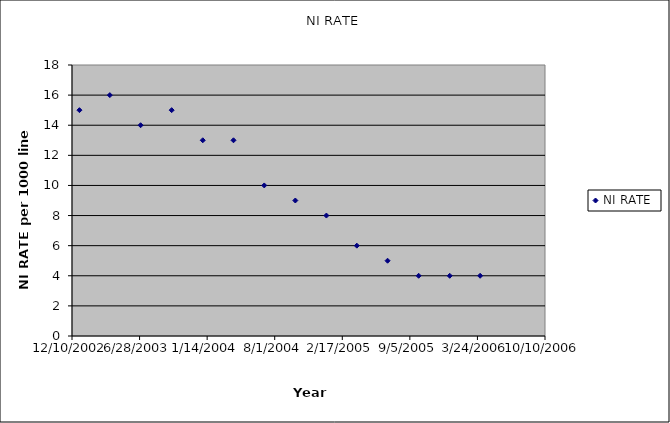
| Category | NI RATE |
|---|---|
| 37622.0 | 15 |
| 37712.0 | 16 |
| 37803.0 | 14 |
| 37895.0 | 15 |
| 37987.0 | 13 |
| 38078.0 | 13 |
| 38169.0 | 10 |
| 38261.0 | 9 |
| 38353.0 | 8 |
| 38443.0 | 6 |
| 38534.0 | 5 |
| 38626.0 | 4 |
| 38718.0 | 4 |
| 38808.0 | 4 |